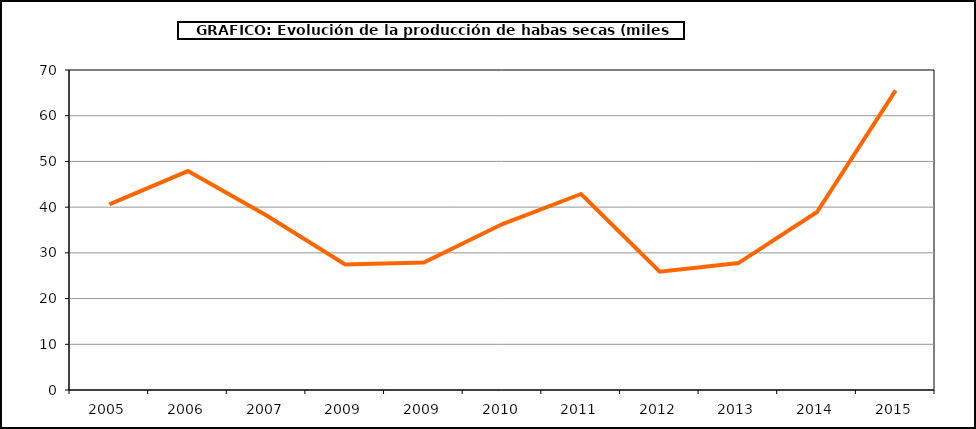
| Category | Producción |
|---|---|
| 2005.0 | 40.6 |
| 2006.0 | 47.886 |
| 2007.0 | 38.184 |
| 2009.0 | 27.475 |
| 2009.0 | 27.866 |
| 2010.0 | 36.305 |
| 2011.0 | 42.882 |
| 2012.0 | 25.888 |
| 2013.0 | 27.759 |
| 2014.0 | 38.941 |
| 2015.0 | 65.532 |